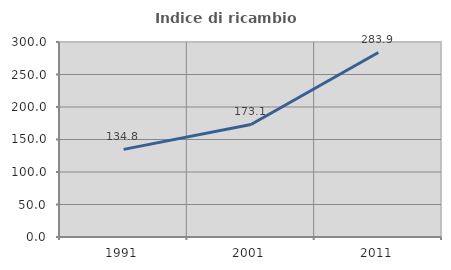
| Category | Indice di ricambio occupazionale  |
|---|---|
| 1991.0 | 134.828 |
| 2001.0 | 173.123 |
| 2011.0 | 283.92 |